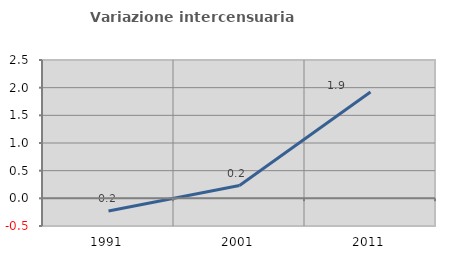
| Category | Variazione intercensuaria annua |
|---|---|
| 1991.0 | -0.229 |
| 2001.0 | 0.232 |
| 2011.0 | 1.921 |